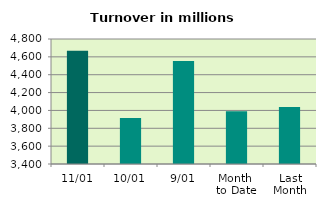
| Category | Series 0 |
|---|---|
| 11/01 | 4669.521 |
| 10/01 | 3914.395 |
| 9/01 | 4553.279 |
| Month 
to Date | 3989.858 |
| Last
Month | 4039.067 |